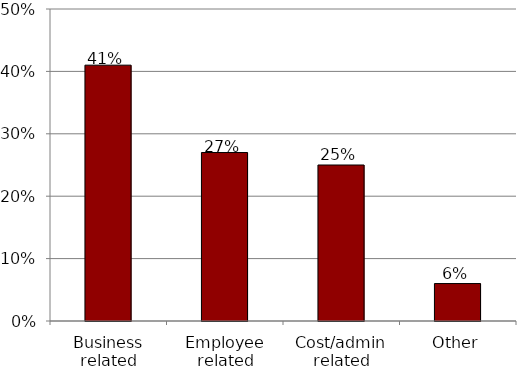
| Category | Series 0 |
|---|---|
| Business related | 0.41 |
| Employee related | 0.27 |
| Cost/admin related | 0.25 |
| Other | 0.06 |